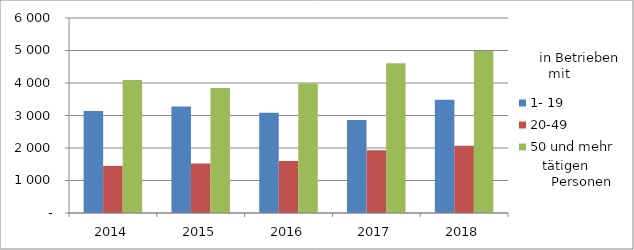
| Category | 1- 19 | 20-49 | 50 und mehr |
|---|---|---|---|
| 2014.0 | 3136 | 1450 | 4090 |
| 2015.0 | 3275 | 1522 | 3844 |
| 2016.0 | 3086 | 1603 | 3988 |
| 2017.0 | 2864 | 1931 | 4609 |
| 2018.0 | 3488 | 2071 | 4982 |